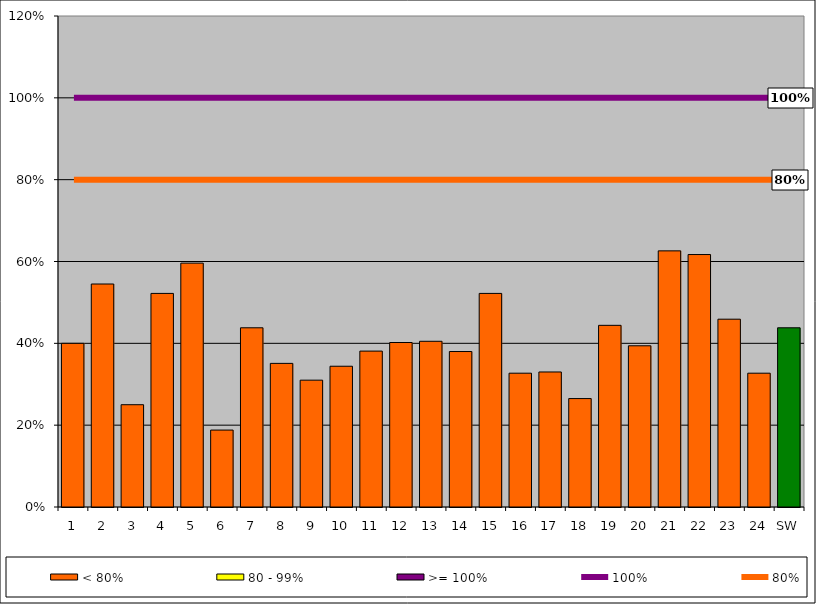
| Category | < 80% | 80 - 99% | >= 100% |
|---|---|---|---|
| 1 | 0.4 | 0 | 0 |
| 2 | 0.545 | 0 | 0 |
| 3 | 0.25 | 0 | 0 |
| 4 | 0.522 | 0 | 0 |
| 5 | 0.596 | 0 | 0 |
| 6 | 0.188 | 0 | 0 |
| 7 | 0.438 | 0 | 0 |
| 8 | 0.351 | 0 | 0 |
| 9 | 0.31 | 0 | 0 |
| 10 | 0.344 | 0 | 0 |
| 11 | 0.381 | 0 | 0 |
| 12 | 0.402 | 0 | 0 |
| 13 | 0.405 | 0 | 0 |
| 14 | 0.38 | 0 | 0 |
| 15 | 0.522 | 0 | 0 |
| 16 | 0.327 | 0 | 0 |
| 17 | 0.33 | 0 | 0 |
| 18 | 0.265 | 0 | 0 |
| 19 | 0.444 | 0 | 0 |
| 20 | 0.394 | 0 | 0 |
| 21 | 0.626 | 0 | 0 |
| 22 | 0.617 | 0 | 0 |
| 23 | 0.459 | 0 | 0 |
| 24 | 0.327 | 0 | 0 |
| SW | 0.438 | 0 | 0 |